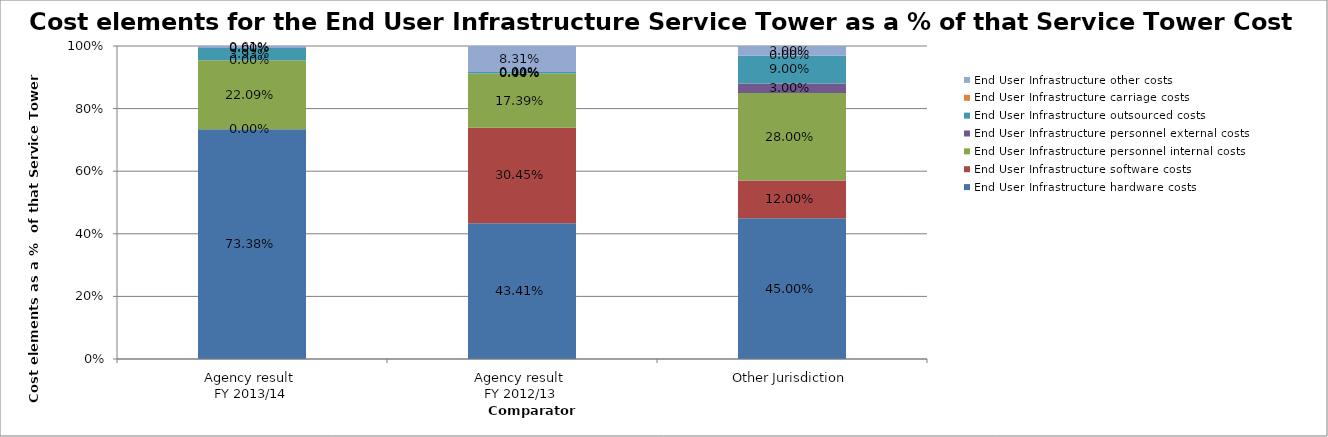
| Category | End User Infrastructure hardware costs | End User Infrastructure software costs | End User Infrastructure personnel internal costs | End User Infrastructure personnel external costs | End User Infrastructure outsourced costs | End User Infrastructure carriage costs | End User Infrastructure other costs |
|---|---|---|---|---|---|---|---|
| Agency result 
FY 2013/14 | 0.734 | 0 | 0.221 | 0 | 0.039 | 0 | 0.006 |
| Agency result 
FY 2012/13 | 0.434 | 0.304 | 0.174 | 0 | 0.004 | 0 | 0.083 |
| Other Jurisdiction | 0.45 | 0.12 | 0.28 | 0.03 | 0.09 | 0 | 0.03 |